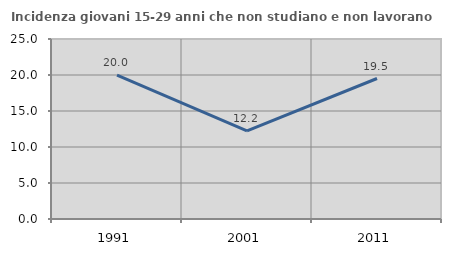
| Category | Incidenza giovani 15-29 anni che non studiano e non lavorano  |
|---|---|
| 1991.0 | 19.979 |
| 2001.0 | 12.232 |
| 2011.0 | 19.512 |